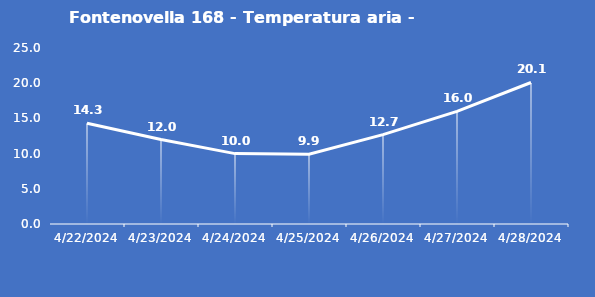
| Category | Fontenovella 168 - Temperatura aria - Grezzo (°C) |
|---|---|
| 4/22/24 | 14.3 |
| 4/23/24 | 12 |
| 4/24/24 | 10 |
| 4/25/24 | 9.9 |
| 4/26/24 | 12.7 |
| 4/27/24 | 16 |
| 4/28/24 | 20.1 |